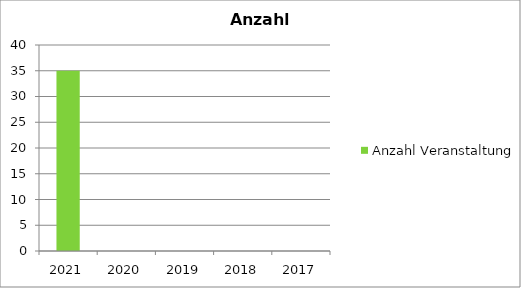
| Category | Anzahl Veranstaltungen |
|---|---|
| 2021.0 | 35 |
| 2020.0 | 0 |
| 2019.0 | 0 |
| 2018.0 | 0 |
| 2017.0 | 0 |